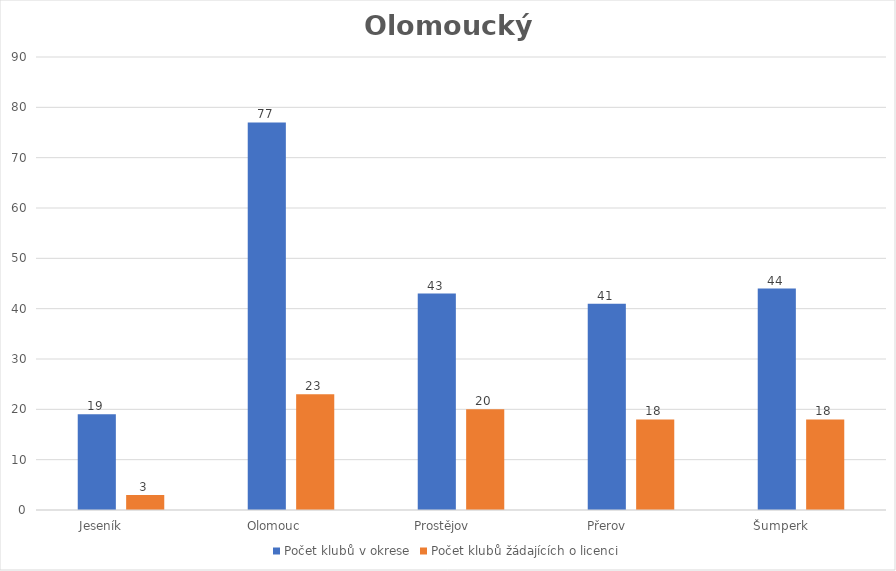
| Category | Počet klubů v okrese | Počet klubů žádajících o licenci |
|---|---|---|
| Jeseník           | 19 | 3 |
| Olomouc         | 77 | 23 |
| Prostějov          | 43 | 20 |
| Přerov             | 41 | 18 |
| Šumperk           | 44 | 18 |